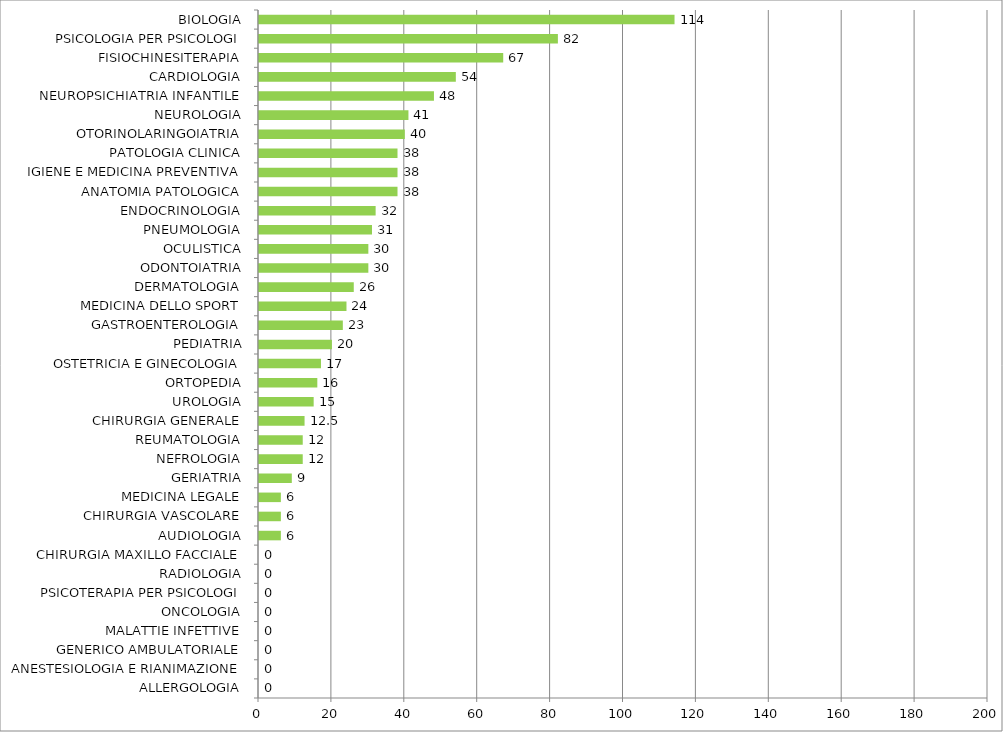
| Category | Series 0 |
|---|---|
| ALLERGOLOGIA | 0 |
| ANESTESIOLOGIA E RIANIMAZIONE | 0 |
| GENERICO AMBULATORIALE | 0 |
| MALATTIE INFETTIVE | 0 |
| ONCOLOGIA | 0 |
| PSICOTERAPIA PER PSICOLOGI | 0 |
| RADIOLOGIA | 0 |
| CHIRURGIA MAXILLO FACCIALE | 0 |
| AUDIOLOGIA | 6 |
| CHIRURGIA VASCOLARE | 6 |
| MEDICINA LEGALE | 6 |
| GERIATRIA | 9 |
| NEFROLOGIA | 12 |
| REUMATOLOGIA | 12 |
| CHIRURGIA GENERALE | 12.5 |
| UROLOGIA | 15 |
| ORTOPEDIA | 16 |
| OSTETRICIA E GINECOLOGIA | 17 |
| PEDIATRIA | 20 |
| GASTROENTEROLOGIA | 23 |
| MEDICINA DELLO SPORT | 24 |
| DERMATOLOGIA | 26 |
| ODONTOIATRIA | 30 |
| OCULISTICA | 30 |
| PNEUMOLOGIA | 31 |
| ENDOCRINOLOGIA | 32 |
| ANATOMIA PATOLOGICA | 38 |
| IGIENE E MEDICINA PREVENTIVA | 38 |
| PATOLOGIA CLINICA | 38 |
| OTORINOLARINGOIATRIA | 40 |
| NEUROLOGIA | 41 |
| NEUROPSICHIATRIA INFANTILE | 48 |
| CARDIOLOGIA | 54 |
| FISIOCHINESITERAPIA | 67 |
| PSICOLOGIA PER PSICOLOGI | 82 |
| BIOLOGIA | 114 |